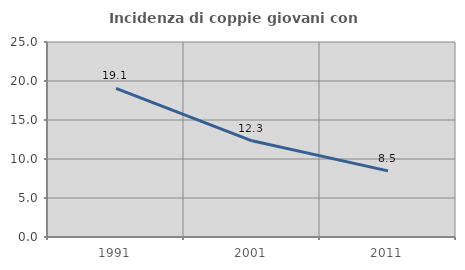
| Category | Incidenza di coppie giovani con figli |
|---|---|
| 1991.0 | 19.058 |
| 2001.0 | 12.335 |
| 2011.0 | 8.475 |